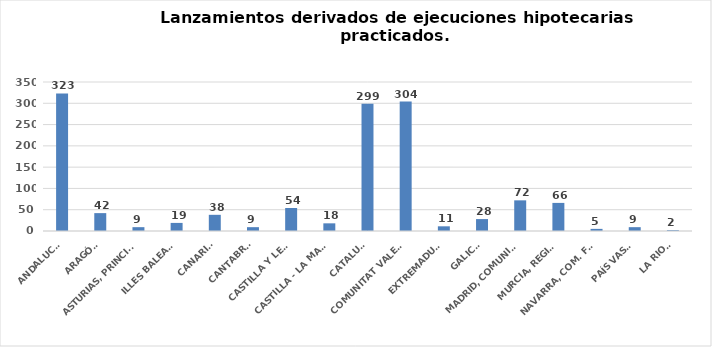
| Category | Series 0 |
|---|---|
| ANDALUCÍA | 323 |
| ARAGÓN | 42 |
| ASTURIAS, PRINCIPADO | 9 |
| ILLES BALEARS | 19 |
| CANARIAS | 38 |
| CANTABRIA | 9 |
| CASTILLA Y LEÓN | 54 |
| CASTILLA - LA MANCHA | 18 |
| CATALUÑA | 299 |
| COMUNITAT VALENCIANA | 304 |
| EXTREMADURA | 11 |
| GALICIA | 28 |
| MADRID, COMUNIDAD | 72 |
| MURCIA, REGIÓN | 66 |
| NAVARRA, COM. FORAL | 5 |
| PAÍS VASCO | 9 |
| LA RIOJA | 2 |